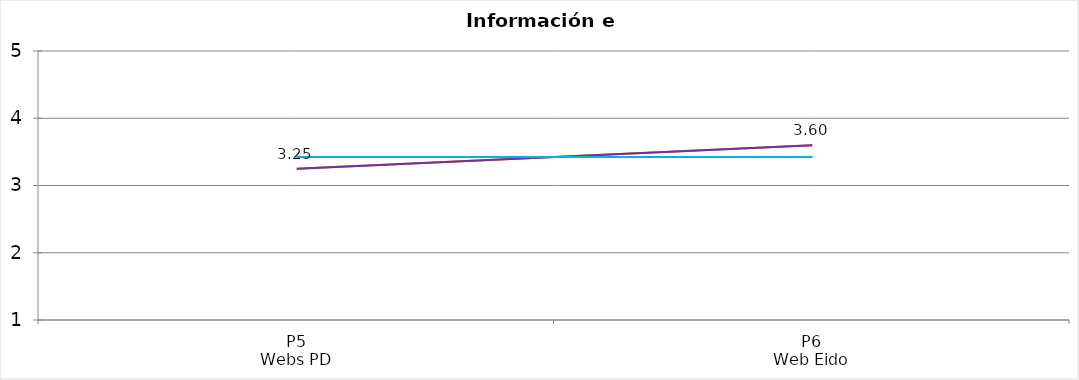
| Category | Valoración (1-5) | MEDIA |
|---|---|---|
| P5
Webs PD | 3.25 | 3.425 |
| P6
Web Eido | 3.6 | 3.425 |